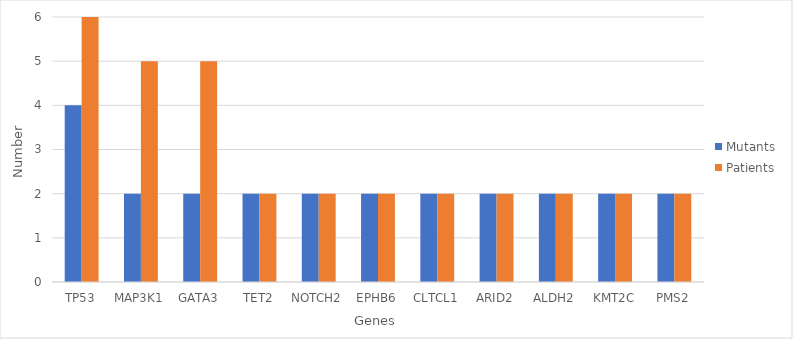
| Category | Mutants | Patients |
|---|---|---|
| TP53 | 4 | 6 |
| MAP3K1 | 2 | 5 |
| GATA3 | 2 | 5 |
| TET2 | 2 | 2 |
| NOTCH2 | 2 | 2 |
| EPHB6 | 2 | 2 |
| CLTCL1 | 2 | 2 |
| ARID2 | 2 | 2 |
| ALDH2 | 2 | 2 |
| KMT2C | 2 | 2 |
| PMS2 | 2 | 2 |